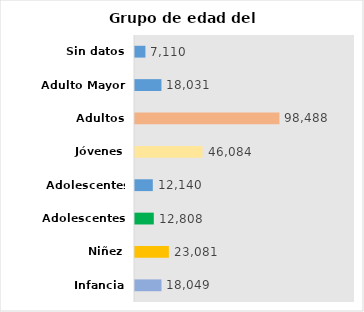
| Category | Series 0 |
|---|---|
| Infancia | 18049 |
| Niñez | 23081 |
| Adolescentes | 12808 |
| Adolescentes tardios | 12140 |
| Jóvenes | 46084 |
| Adultos | 98488 |
| Adulto Mayor | 18031 |
| Sin datos | 7110 |